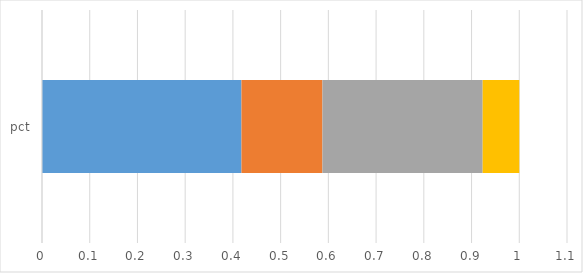
| Category | 03 - IT Infrastructure, IT Security, and IT Management | 04 - Grants and Other Transferred Funding | 01 - Mission Delivery | 02 - Administrative Services and Support Systems |
|---|---|---|---|---|
| pct | 0.418 | 0.17 | 0.336 | 0.077 |